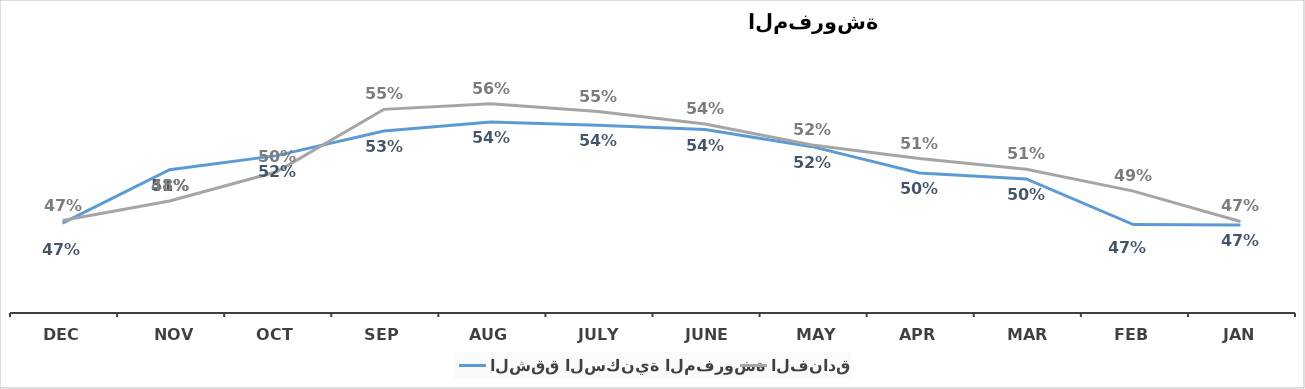
| Category | الشقق السكنية المفروشة | الفنادق |
|---|---|---|
| Jan | 0.465 | 0.468 |
| Feb | 0.466 | 0.49 |
| Mar | 0.499 | 0.506 |
| Apr | 0.504 | 0.514 |
| May | 0.523 | 0.524 |
| June | 0.536 | 0.54 |
| July | 0.539 | 0.549 |
| Aug | 0.541 | 0.555 |
| Sep | 0.535 | 0.551 |
| Oct | 0.517 | 0.505 |
| Nov | 0.506 | 0.483 |
| Dec | 0.467 | 0.468 |